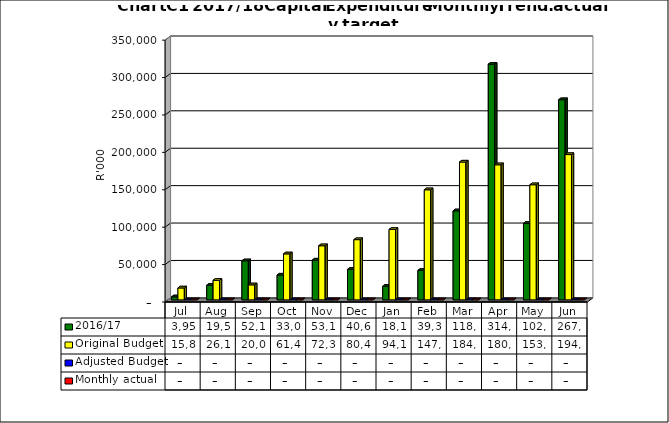
| Category | 2016/17 | Original Budget | Adjusted Budget | Monthly actual |
|---|---|---|---|---|
| Jul | 3958013.321 | 15888227.121 | 0 | 0 |
| Aug | 19539878.957 | 26147045.201 | 0 | 0 |
| Sep | 52133213.882 | 20000000 | 0 | 0 |
| Oct | 33094013.348 | 61424090.403 | 0 | 0 |
| Nov | 53156380.64 | 72300520.141 | 0 | 0 |
| Dec | 40635932.119 | 80450520.141 | 0 | 0 |
| Jan | 18105088 | 94117062.52 | 0 | 0 |
| Feb | 39318754.662 | 147118047.537 | 0 | 0 |
| Mar | 118947063.672 | 184167062.52 | 0 | 0 |
| Apr | 314968044.502 | 180519809.357 | 0 | 0 |
| May | 102136886.68 | 153826239.095 | 0 | 0 |
| Jun | 267506089.874 | 194159375.962 | 0 | 0 |